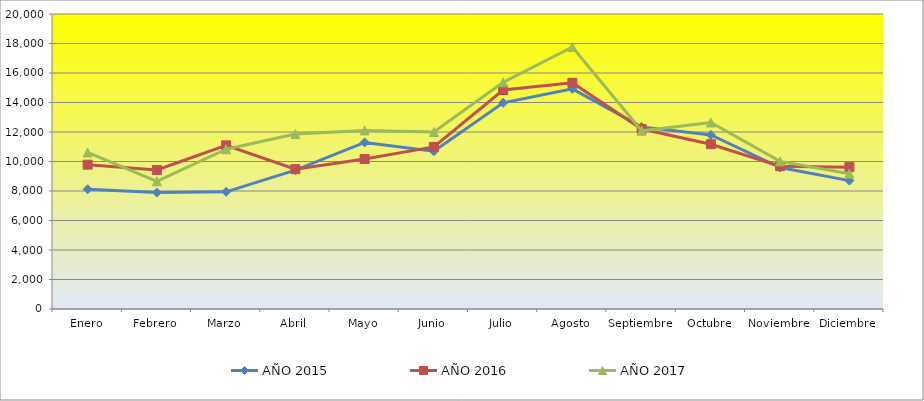
| Category | AÑO 2015 | AÑO 2016 | AÑO 2017 |
|---|---|---|---|
| Enero | 8118 | 9784 | 10612.13 |
| Febrero | 7891 | 9425 | 8656.876 |
| Marzo | 7944 | 11094 | 10830.667 |
| Abril | 9410 | 9480 | 11859.569 |
| Mayo | 11293 | 10168 | 12108.845 |
| Junio | 10698 | 10988 | 12002.448 |
| Julio | 13976 | 14847 | 15369.865 |
| Agosto | 14928 | 15337 | 17761.825 |
| Septiembre | 12345 | 12204 | 12081.856 |
| Octubre | 11800 | 11173 | 12646.309 |
| Noviembre | 9591 | 9681 | 10009.632 |
| Diciembre | 8705 | 9617 | 9175.019 |